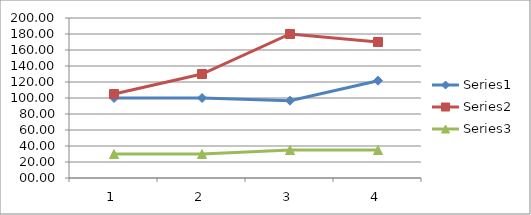
| Category | Series 0 | Series 1 | Series 2 |
|---|---|---|---|
| 0 | 100 | 105 | 30 |
| 1 | 100 | 130 | 30 |
| 2 | 96.66 | 180 | 35 |
| 3 | 121.66 | 170 | 35 |